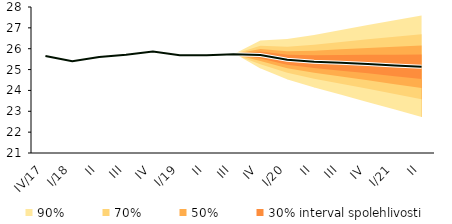
| Category | linka | Centerline |
|---|---|---|
| IV/17 | 25.651 | 25.651 |
| I/18 | 25.402 | 25.402 |
| II | 25.599 | 25.599 |
| III | 25.711 | 25.711 |
| IV | 25.861 | 25.861 |
| I/19 | 25.684 | 25.684 |
| II | 25.684 | 25.684 |
| III | 25.74 | 25.74 |
| IV | 25.7 | 25.7 |
| I/20 | 25.471 | 25.471 |
| II | 25.375 | 25.375 |
| III | 25.324 | 25.324 |
| IV | 25.263 | 25.263 |
| I/21 | 25.2 | 25.2 |
| II | 25.134 | 25.134 |